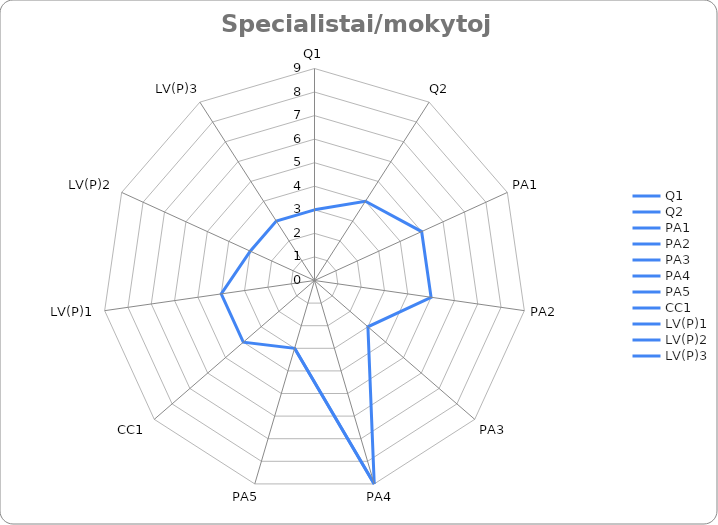
| Category | Series 0 |
|---|---|
| Q1 | 3 |
| Q2 | 4 |
| PA1 | 5 |
| PA2 | 5 |
| PA3 | 3 |
| PA4 | 9 |
| PA5 | 3 |
| CC1 | 4 |
| LV(P)1 | 4 |
| LV(P)2 | 3 |
| LV(P)3 | 3 |